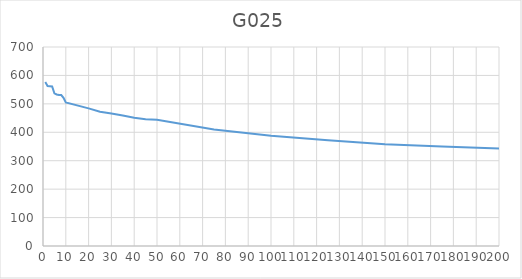
| Category | G025 |
|---|---|
| 1.0 | 577 |
| 2.0 | 563 |
| 3.0 | 562 |
| 4.0 | 561 |
| 5.0 | 537 |
| 6.0 | 533 |
| 7.0 | 531 |
| 8.0 | 531 |
| 9.0 | 521 |
| 10.0 | 505 |
| 20.0 | 484 |
| 25.0 | 472 |
| 30.0 | 466 |
| 35.0 | 459 |
| 40.0 | 451 |
| 45.0 | 446 |
| 50.0 | 444 |
| 75.0 | 410 |
| 100.0 | 388 |
| 125.0 | 372 |
| 150.0 | 358 |
| 175.0 | 350 |
| 200.0 | 343 |